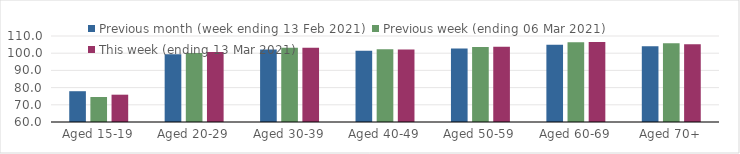
| Category | Previous month (week ending 13 Feb 2021) | Previous week (ending 06 Mar 2021) | This week (ending 13 Mar 2021) |
|---|---|---|---|
| Aged 15-19 | 77.9 | 74.52 | 75.88 |
| Aged 20-29 | 99.41 | 100.17 | 100.7 |
| Aged 30-39 | 102.14 | 103.1 | 103.15 |
| Aged 40-49 | 101.38 | 102.23 | 102.18 |
| Aged 50-59 | 102.7 | 103.57 | 103.8 |
| Aged 60-69 | 104.96 | 106.41 | 106.48 |
| Aged 70+ | 103.97 | 105.8 | 105.27 |